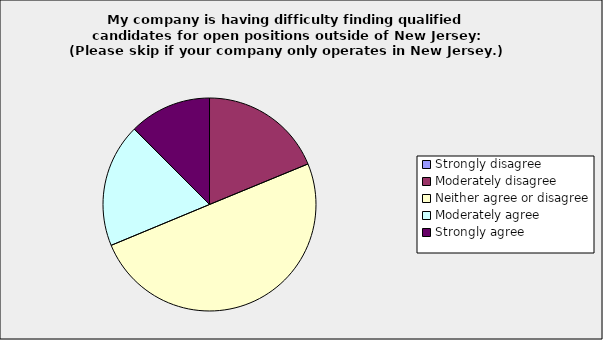
| Category | Series 0 |
|---|---|
| Strongly disagree | 0 |
| Moderately disagree | 0.188 |
| Neither agree or disagree | 0.5 |
| Moderately agree | 0.188 |
| Strongly agree | 0.125 |